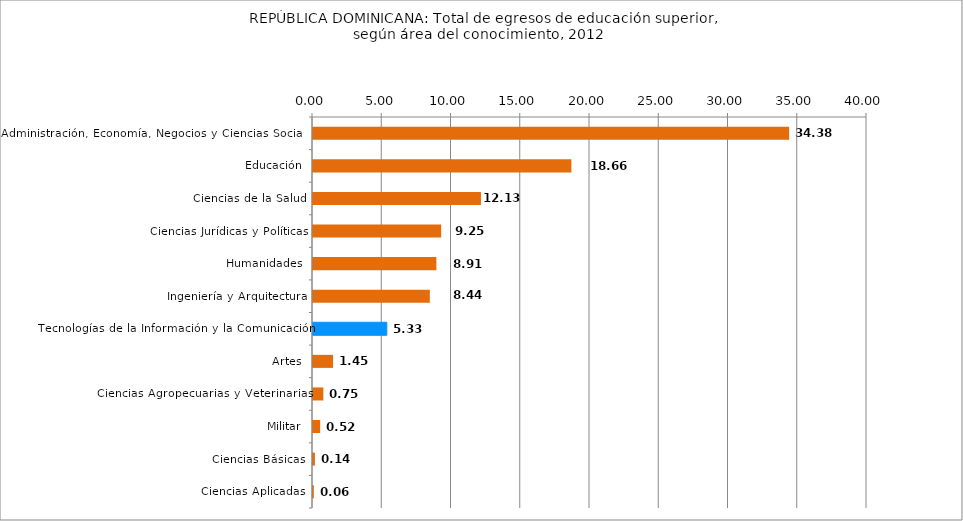
| Category | REPÚBLICA DOMINICANA: Total de egresos de educación superior,
según área del conocimiento, 2012 |
|---|---|
| Administración, Economía, Negocios y Ciencias Sociales | 34.378 |
| Educación | 18.655 |
| Ciencias de la Salud | 12.127 |
| Ciencias Jurídicas y Políticas | 9.255 |
| Humanidades | 8.909 |
| Ingeniería y Arquitectura | 8.435 |
| Tecnologías de la Información y la Comunicación | 5.329 |
| Artes | 1.447 |
| Ciencias Agropecuarias y Veterinarias | 0.747 |
| Militar | 0.518 |
| Ciencias Básicas | 0.139 |
| Ciencias Aplicadas | 0.061 |